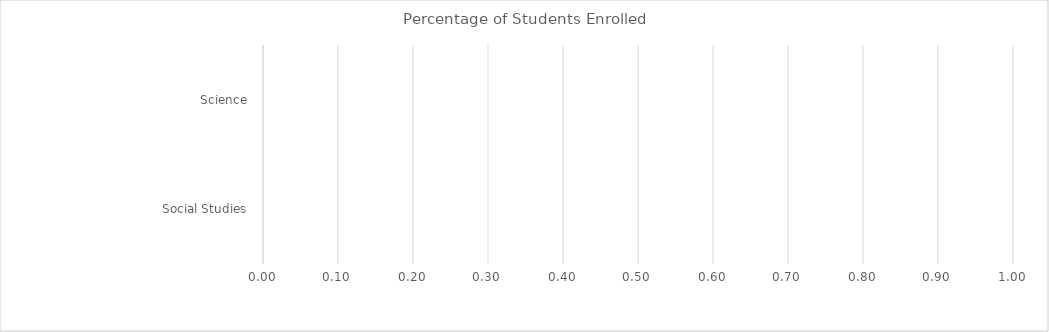
| Category | Benchmark | Entire LEA  | Title IV-A Identified Schools |
|---|---|---|---|
| Science  | 0 | 0 | 0 |
| Social Studies  | 0 | 0 | 0 |